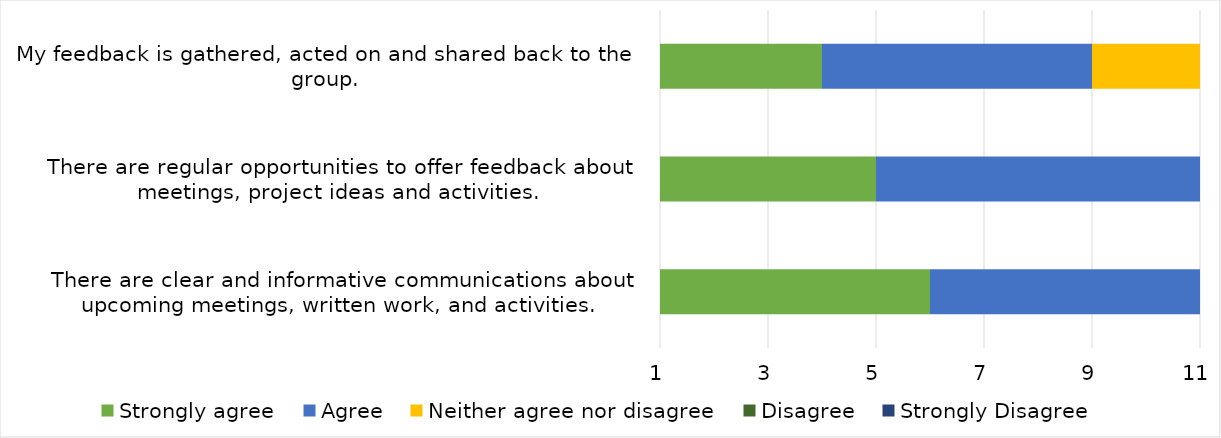
| Category | Strongly agree
 | Agree
 | Neither agree nor disagree
 | Disagree
 | Strongly Disagree 
 |
|---|---|---|---|---|---|
| There are clear and informative communications about upcoming meetings, written work, and activities. 

 | 6 | 5 | 0 | 0 | 0 |
| There are regular opportunities to offer feedback about meetings, project ideas and activities. 
 | 5 | 6 | 0 | 0 | 0 |
| My feedback is gathered, acted on and shared back to the group. 
 | 4 | 5 | 2 | 0 | 0 |